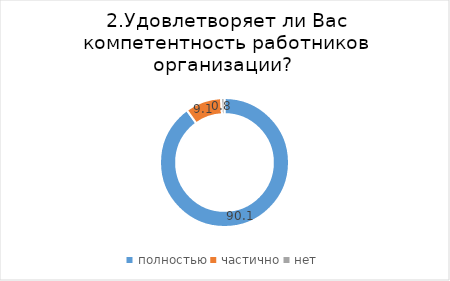
| Category | Series 0 |
|---|---|
| полностью | 90.083 |
| частично | 9.091 |
| нет | 0.826 |